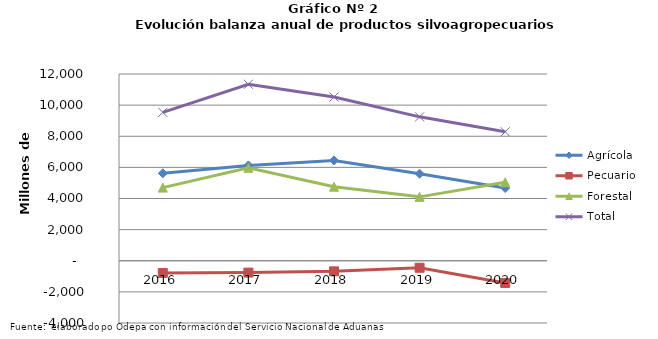
| Category | Agrícola | Pecuario | Forestal | Total |
|---|---|---|---|---|
| 2016.0 | 5619304 | -782654 | 4700192 | 9536842 |
| 2017.0 | 6126434 | -761998 | 5976134 | 11340570 |
| 2018.0 | 6446329 | -681646 | 4755333 | 10520016 |
| 2019.0 | 5590965 | -450130 | 4105622 | 9246457 |
| 2020.0 | 4671880 | -1424944 | 5041537 | 8288473 |